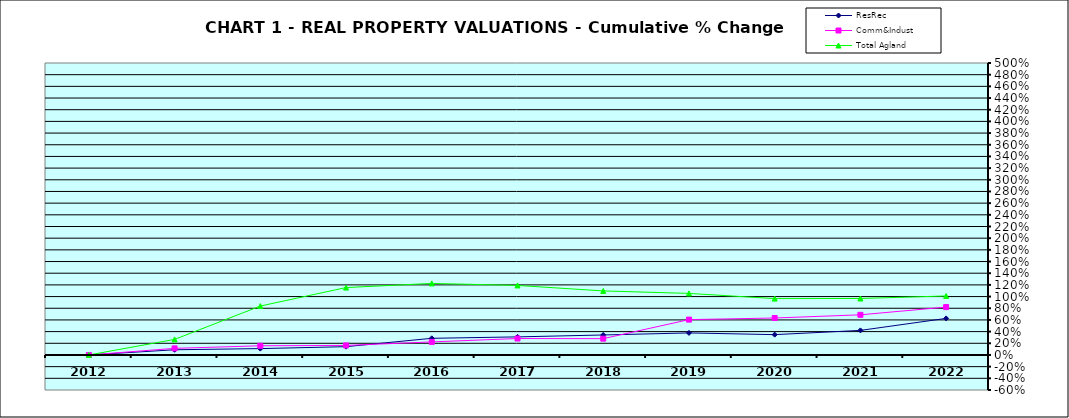
| Category | ResRec | Comm&Indust | Total Agland |
|---|---|---|---|
| 2012.0 | 0 | 0 | 0 |
| 2013.0 | 0.089 | 0.113 | 0.266 |
| 2014.0 | 0.109 | 0.158 | 0.838 |
| 2015.0 | 0.142 | 0.163 | 1.154 |
| 2016.0 | 0.285 | 0.224 | 1.225 |
| 2017.0 | 0.31 | 0.281 | 1.191 |
| 2018.0 | 0.342 | 0.279 | 1.097 |
| 2019.0 | 0.377 | 0.605 | 1.054 |
| 2020.0 | 0.348 | 0.633 | 0.965 |
| 2021.0 | 0.421 | 0.687 | 0.967 |
| 2022.0 | 0.626 | 0.82 | 1.01 |